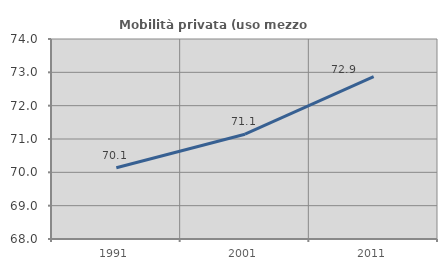
| Category | Mobilità privata (uso mezzo privato) |
|---|---|
| 1991.0 | 70.139 |
| 2001.0 | 71.144 |
| 2011.0 | 72.868 |